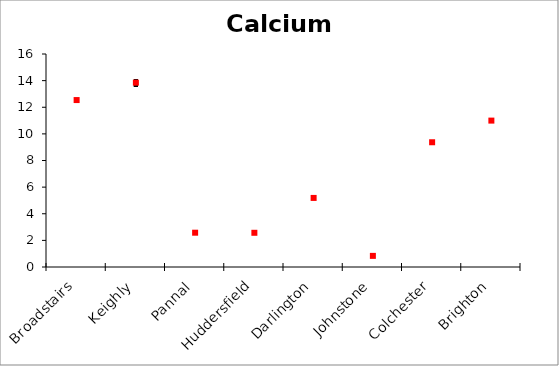
| Category | Calcium | Series 1 | Series 2 |
|---|---|---|---|
| Broadstairs | 12.62 | 12.46 | 12.54 |
| Keighly | 14.11 | 13.52 | 13.848 |
| Pannal | 2.622 | 2.502 | 2.577 |
| Huddersfield | 2.616 | 2.492 | 2.57 |
| Darlington | 5.223 | 5.166 | 5.189 |
| Johnstone | 0.855 | 0.824 | 0.836 |
| Colchester | 9.441 | 9.321 | 9.371 |
| Brighton | 11.09 | 10.91 | 10.997 |